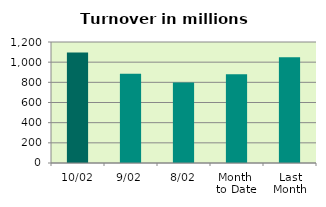
| Category | Series 0 |
|---|---|
| 10/02 | 1095.953 |
| 9/02 | 885.634 |
| 8/02 | 797.324 |
| Month 
to Date | 880.237 |
| Last
Month | 1049.647 |